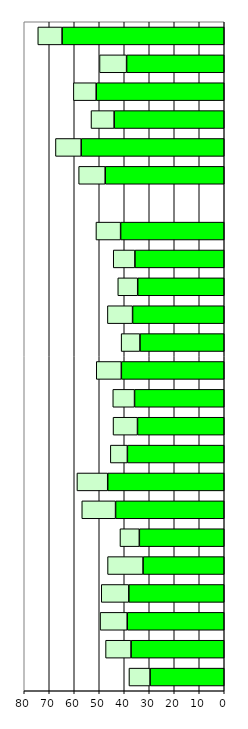
| Category | Series 0 | Series 1 |
|---|---|---|
| 0 | 29.672 | 8.447 |
| 1 | 37.285 | 10.187 |
| 2 | 38.818 | 10.85 |
| 3 | 38.174 | 11.023 |
| 4 | 32.486 | 14.184 |
| 5 | 33.968 | 7.744 |
| 6 | 43.469 | 13.516 |
| 7 | 46.616 | 12.315 |
| 8 | 38.745 | 6.819 |
| 9 | 34.703 | 9.773 |
| 10 | 35.884 | 8.697 |
| 11 | 41.164 | 10.03 |
| 12 | 33.718 | 7.522 |
| 13 | 36.667 | 10.069 |
| 14 | 34.619 | 7.958 |
| 15 | 35.733 | 8.67 |
| 16 | 41.451 | 9.869 |
| 17 | 0 | 0 |
| 18 | 47.622 | 10.609 |
| 19 | 57.227 | 10.291 |
| 20 | 44.048 | 9.245 |
| 21 | 51.22 | 9.13 |
| 22 | 39.058 | 10.832 |
| 23 | 64.868 | 9.709 |